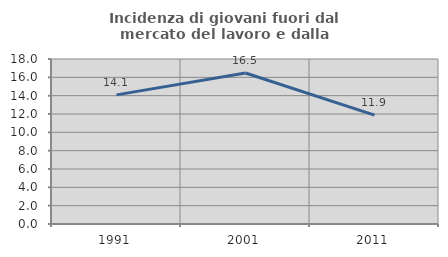
| Category | Incidenza di giovani fuori dal mercato del lavoro e dalla formazione  |
|---|---|
| 1991.0 | 14.085 |
| 2001.0 | 16.477 |
| 2011.0 | 11.875 |